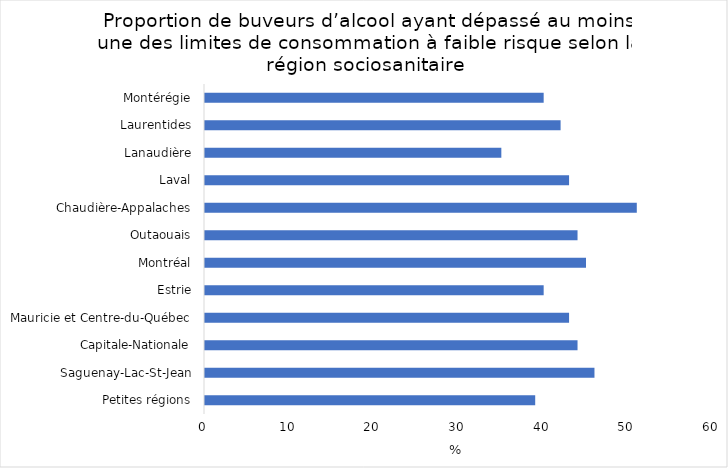
| Category | Series 0 |
|---|---|
| Petites régions | 39 |
| Saguenay-Lac-St-Jean | 46 |
| Capitale-Nationale | 44 |
| Mauricie et Centre-du-Québec | 43 |
| Estrie | 40 |
| Montréal | 45 |
| Outaouais | 44 |
| Chaudière-Appalaches | 51 |
| Laval | 43 |
| Lanaudière | 35 |
| Laurentides | 42 |
| Montérégie | 40 |